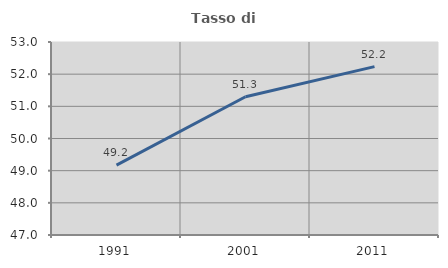
| Category | Tasso di occupazione   |
|---|---|
| 1991.0 | 49.174 |
| 2001.0 | 51.299 |
| 2011.0 | 52.234 |